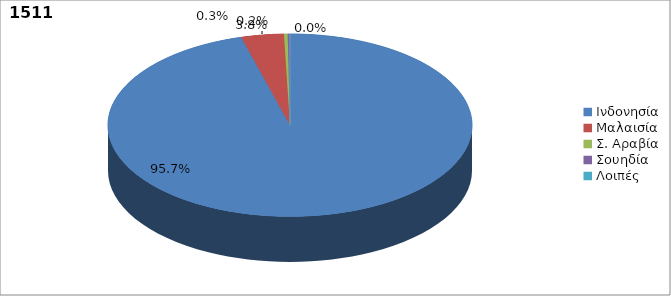
| Category | Series 0 |
|---|---|
| Ινδονησία | 0.957 |
| Μαλαισία | 0.038 |
| Σ. Αραβία | 0.003 |
| Σουηδία | 0.002 |
| Λοιπές | 0 |